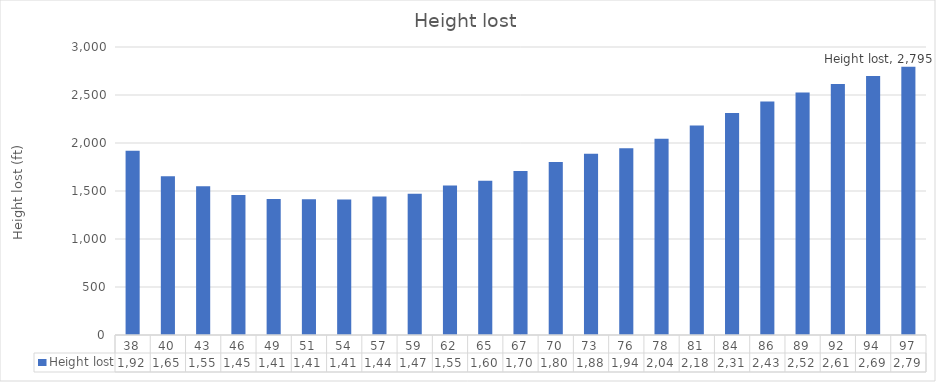
| Category | Height lost |
|---|---|
| 37.772827738637936 | 1919.741 |
| 40.470886862826355 | 1653.931 |
| 43.16894598701478 | 1550.56 |
| 45.867005111203206 | 1459.351 |
| 48.56506423539163 | 1416.561 |
| 51.26312335958006 | 1414.546 |
| 53.961182483768475 | 1412.733 |
| 56.6592416079569 | 1443.908 |
| 59.357300732145326 | 1472.249 |
| 62.05535985633375 | 1558.051 |
| 64.75341898052217 | 1607.988 |
| 67.4514781047106 | 1709.062 |
| 70.14953722889902 | 1802.36 |
| 72.84759635308744 | 1888.748 |
| 75.54565547727587 | 1944.353 |
| 78.24371460146429 | 2043.65 |
| 80.94177372565271 | 2182.27 |
| 83.63983284984114 | 2311.946 |
| 86.33789197402956 | 2433.518 |
| 89.03595109821799 | 2526.839 |
| 91.73401022240641 | 2614.67 |
| 94.43206934659483 | 2697.482 |
| 97.13012847078326 | 2794.837 |